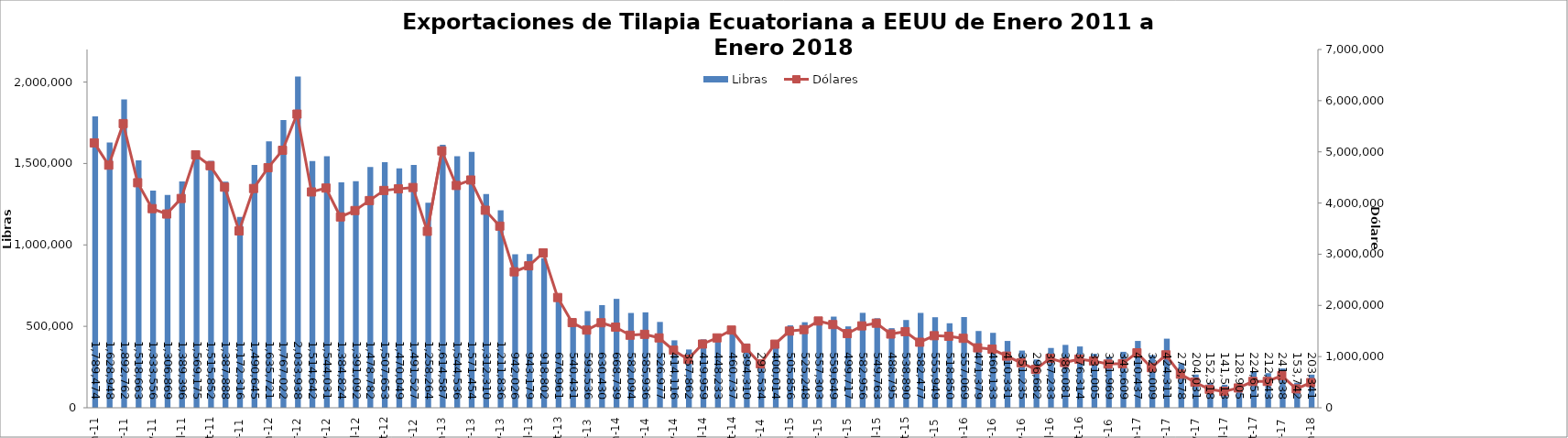
| Category | Libras  |
|---|---|
| 2011-01-01 | 1789473.82 |
| 2011-02-01 | 1628948.076 |
| 2011-03-01 | 1892761.535 |
| 2011-04-01 | 1518662.961 |
| 2011-05-01 | 1333555.926 |
| 2011-06-01 | 1306869.243 |
| 2011-07-01 | 1389396.24 |
| 2011-08-01 | 1569174.756 |
| 2011-09-01 | 1515852.096 |
| 2011-10-01 | 1387888.293 |
| 2011-11-01 | 1172315.891 |
| 2011-12-01 | 1490644.699 |
| 2012-01-01 | 1635720.607 |
| 2012-02-01 | 1767022.174 |
| 2012-03-01 | 2033937.505 |
| 2012-04-01 | 1514641.77 |
| 2012-05-01 | 1544031.293 |
| 2012-06-01 | 1384823.899 |
| 2012-07-01 | 1391091.577 |
| 2012-08-01 | 1478781.747 |
| 2012-09-01 | 1507653.188 |
| 2012-10-01 | 1470049.326 |
| 2012-11-01 | 1491526.539 |
| 2012-12-01 | 1258264 |
| 2013-01-01 | 1614587 |
| 2013-02-01 | 1544536.146 |
| 2013-03-01 | 1571454.312 |
| 2013-04-01 | 1312310.196 |
| 2013-05-01 | 1211835.551 |
| 2013-06-01 | 942025.58 |
| 2013-07-01 | 943178.586 |
| 2013-08-01 | 918802.324 |
| 2013-09-01 | 670961.192 |
| 2013-10-01 | 540431.235 |
| 2013-11-01 | 593535.64 |
| 2013-12-01 | 630429.621 |
| 2014-01-01 | 668739 |
| 2014-02-01 | 582093.766 |
| 2014-03-01 | 585936.383 |
| 2014-04-01 | 526976.561 |
| 2014-05-01 | 414116.473 |
| 2014-06-01 | 357861.695 |
| 2014-07-01 | 419958.663 |
| 2014-08-01 | 448233 |
| 2014-09-01 | 460737.149 |
| 2014-10-01 | 394310.347 |
| 2014-11-01 | 293533.672 |
| 2014-12-01 | 400013.647 |
| 2015-01-01 | 505856.493 |
| 2015-02-01 | 525248 |
| 2015-03-01 | 557303.039 |
| 2015-04-01 | 559648.733 |
| 2015-05-01 | 499716.682 |
| 2015-06-01 | 582955.764 |
| 2015-07-01 | 549763.307 |
| 2015-08-01 | 488795.094 |
| 2015-09-01 | 538890.219 |
| 2015-10-01 | 582477.366 |
| 2015-11-01 | 555949.414 |
| 2015-12-01 | 518850.405 |
| 2016-01-01 | 557069.351 |
| 2016-02-01 | 471378.754 |
| 2016-03-01 | 460133.089 |
| 2016-04-01 | 410331.175 |
| 2016-05-01 | 351235 |
| 2016-06-01 | 296682 |
| 2016-07-01 | 367233.45 |
| 2016-08-01 | 386080.575 |
| 2016-09-01 | 376314.197 |
| 2016-10-01 | 331005.258 |
| 2016-11-01 | 311968.537 |
| 2016-12-01 | 343608.956 |
| 2017-01-01 | 410436.996 |
| 2017-02-01 | 323009.174 |
| 2017-03-01 | 424310.544 |
| 2017-04-01 | 273577.632 |
| 2017-05-01 | 204031.321 |
| 2017-06-01 | 152318.019 |
| 2017-07-01 | 141513.274 |
| 2017-08-01 | 128905.167 |
| 2017-09-01 | 224650.945 |
| 2017-10-01 | 212543.281 |
| 2017-11-01 | 241337.562 |
| 2017-12-01 | 153742.19 |
| 2018-01-01 | 203341.281 |